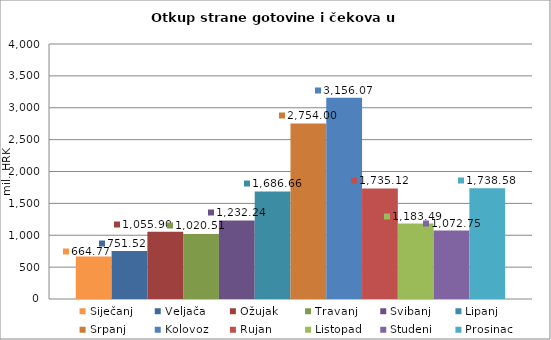
| Category | Siječanj | Veljača | Ožujak | Travanj | Svibanj | Lipanj | Srpanj | Kolovoz | Rujan | Listopad | Studeni | Prosinac |
|---|---|---|---|---|---|---|---|---|---|---|---|---|
| 0 | 664.77 | 751.521 | 1055.898 | 1020.514 | 1232.237 | 1686.655 | 2754 | 3156.067 | 1735.119 | 1183.495 | 1072.746 | 1738.584 |